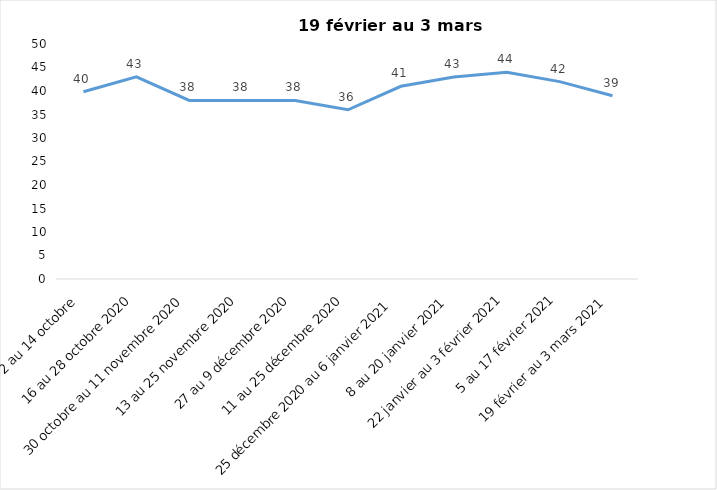
| Category | Toujours aux trois mesures |
|---|---|
| 2 au 14 octobre  | 39.85 |
| 16 au 28 octobre 2020 | 43 |
| 30 octobre au 11 novembre 2020 | 38 |
| 13 au 25 novembre 2020 | 38 |
| 27 au 9 décembre 2020 | 38 |
| 11 au 25 décembre 2020 | 36 |
| 25 décembre 2020 au 6 janvier 2021 | 41 |
| 8 au 20 janvier 2021 | 43 |
| 22 janvier au 3 février 2021 | 44 |
| 5 au 17 février 2021 | 42 |
| 19 février au 3 mars 2021 | 39 |